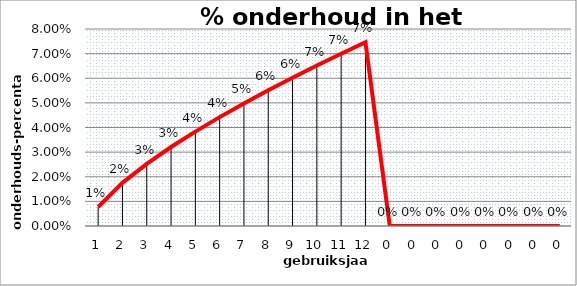
| Category | % onderhoud in het gebruiksjaar |
|---|---|
| 0 | 0.008 |
| 1 | 0.018 |
| 2 | 0.025 |
| 3 | 0.032 |
| 4 | 0.038 |
| 5 | 0.044 |
| 6 | 0.05 |
| 7 | 0.055 |
| 8 | 0.06 |
| 9 | 0.065 |
| 10 | 0.07 |
| 11 | 0.075 |
| 12 | 0 |
| 13 | 0 |
| 14 | 0 |
| 15 | 0 |
| 16 | 0 |
| 17 | 0 |
| 18 | 0 |
| 19 | 0 |